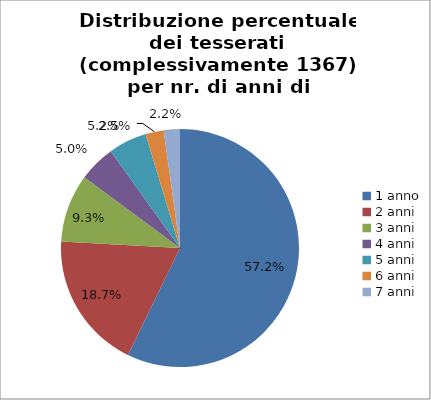
| Category | Nr. Tesserati |
|---|---|
| 1 anno | 782 |
| 2 anni | 255 |
| 3 anni | 127 |
| 4 anni | 68 |
| 5 anni | 71 |
| 6 anni | 34 |
| 7 anni | 30 |